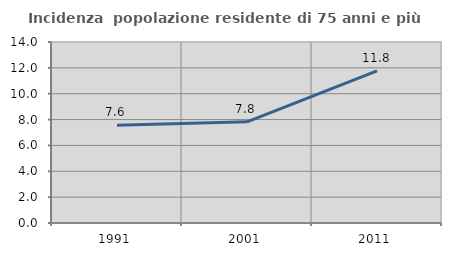
| Category | Incidenza  popolazione residente di 75 anni e più |
|---|---|
| 1991.0 | 7.569 |
| 2001.0 | 7.83 |
| 2011.0 | 11.771 |